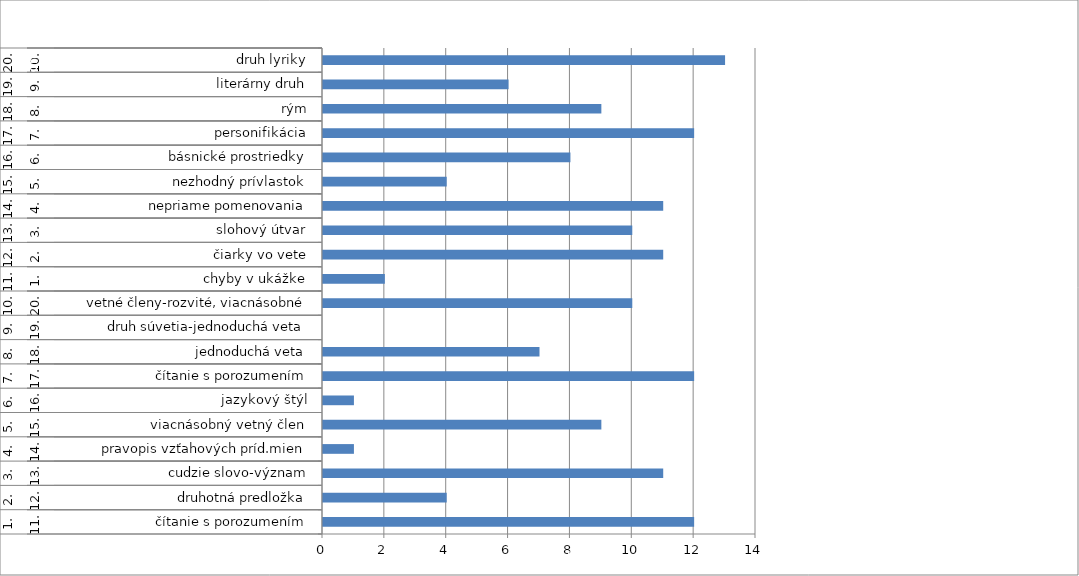
| Category | Počet správnych odpovedí |
|---|---|
| 0 | 12 |
| 1 | 4 |
| 2 | 11 |
| 3 | 1 |
| 4 | 9 |
| 5 | 1 |
| 6 | 12 |
| 7 | 7 |
| 8 | 0 |
| 9 | 10 |
| 10 | 2 |
| 11 | 11 |
| 12 | 10 |
| 13 | 11 |
| 14 | 4 |
| 15 | 8 |
| 16 | 12 |
| 17 | 9 |
| 18 | 6 |
| 19 | 13 |